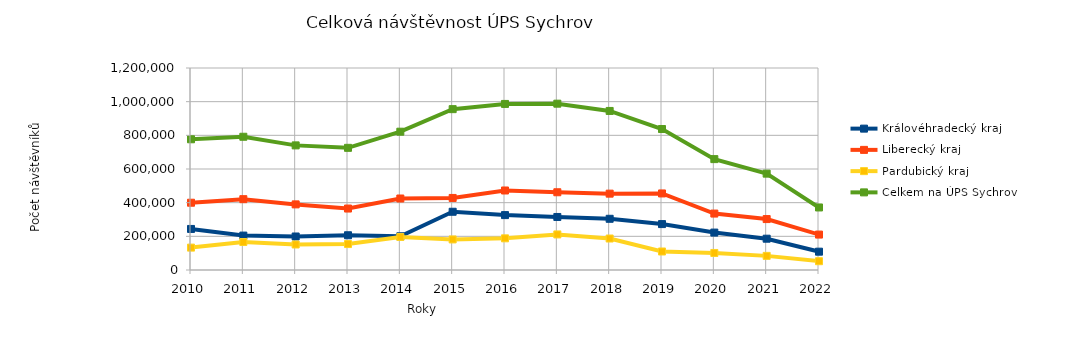
| Category | Královéhradecký kraj | Liberecký kraj | Pardubický kraj | Celkem na ÚPS Sychrov |
|---|---|---|---|---|
| 2010.0 | 243910 | 399672 | 133004 | 776586 |
| 2011.0 | 204481 | 420780 | 166238 | 791499 |
| 2012.0 | 199025 | 389781 | 151509 | 740315 |
| 2013.0 | 206419 | 365108 | 154165 | 725692 |
| 2014.0 | 200438 | 424718 | 196473 | 821629 |
| 2015.0 | 345970 | 428023 | 181567 | 955560 |
| 2016.0 | 326137 | 472318 | 188108 | 986563 |
| 2017.0 | 314983 | 461803 | 211268 | 988054 |
| 2018.0 | 304267 | 453568 | 187017 | 944852 |
| 2019.0 | 272720 | 454785 | 109949 | 837454 |
| 2020.0 | 222238 | 335261 | 101211 | 658710 |
| 2021.0 | 185934 | 302574 | 83925 | 572433 |
| 2022.0 | 108869 | 210455 | 52197 | 371521 |